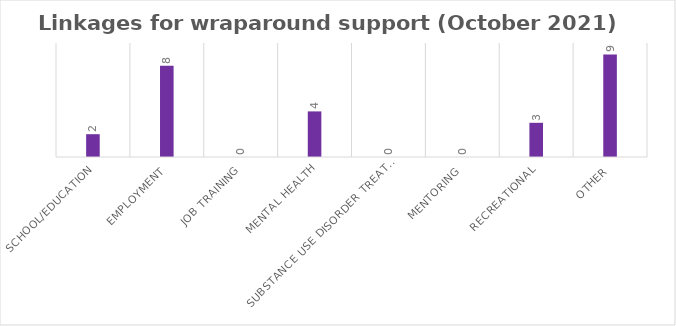
| Category | Series 0 |
|---|---|
| School/education | 2 |
| Employment | 8 |
| Job Training | 0 |
| Mental Health | 4 |
| Substance Use Disorder Treatment | 0 |
| Mentoring | 0 |
| Recreational | 3 |
| Other | 9 |